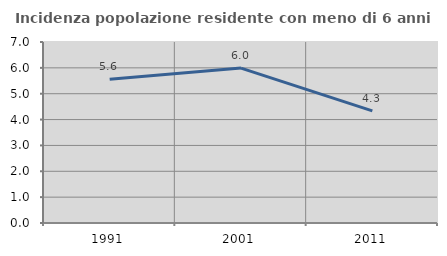
| Category | Incidenza popolazione residente con meno di 6 anni |
|---|---|
| 1991.0 | 5.556 |
| 2001.0 | 5.991 |
| 2011.0 | 4.338 |